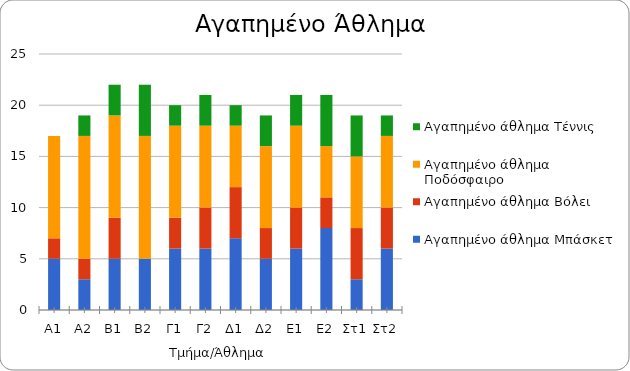
| Category | Αγαπημένο άθλημα Μπάσκετ | Αγαπημένο άθλημα Βόλει | Αγαπημένο άθλημα Ποδόσφαιρο | Αγαπημένο άθλημα Τέννις |
|---|---|---|---|---|
| A1 | 5 | 2 | 10 | 0 |
| A2 | 3 | 2 | 12 | 2 |
| B1 | 5 | 4 | 10 | 3 |
| B2 | 5 | 0 | 12 | 5 |
| Γ1 | 6 | 3 | 9 | 2 |
| Γ2 | 6 | 4 | 8 | 3 |
| Δ1 | 7 | 5 | 6 | 2 |
| Δ2 | 5 | 3 | 8 | 3 |
| Ε1 | 6 | 4 | 8 | 3 |
| Ε2 | 8 | 3 | 5 | 5 |
| Στ1 | 3 | 5 | 7 | 4 |
| Στ2 | 6 | 4 | 7 | 2 |